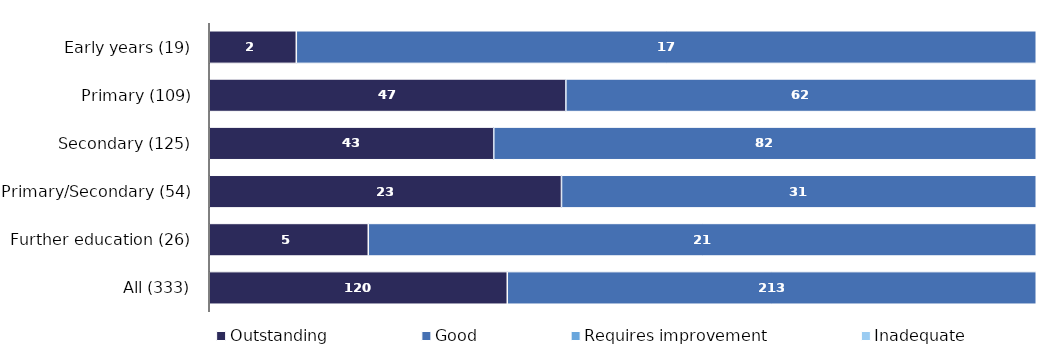
| Category | Outstanding | Good | Requires improvement | Inadequate |
|---|---|---|---|---|
| Early years (19) | 2 | 17 | 0 | 0 |
| Primary (109) | 47 | 62 | 0 | 0 |
| Secondary (125) | 43 | 82 | 0 | 0 |
| Primary/Secondary (54) | 23 | 31 | 0 | 0 |
| Further education (26) | 5 | 21 | 0 | 0 |
| All (333) | 120 | 213 | 0 | 0 |